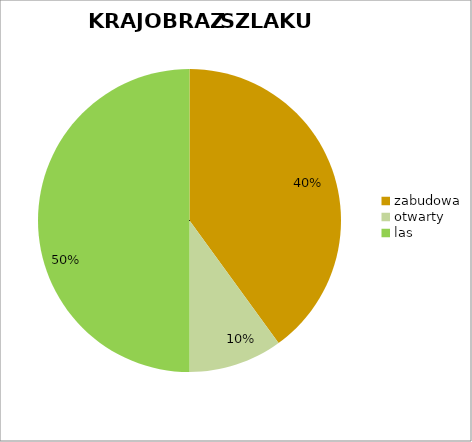
| Category | Series 0 |
|---|---|
| zabudowa | 0.4 |
| otwarty | 0.1 |
| las | 0.5 |